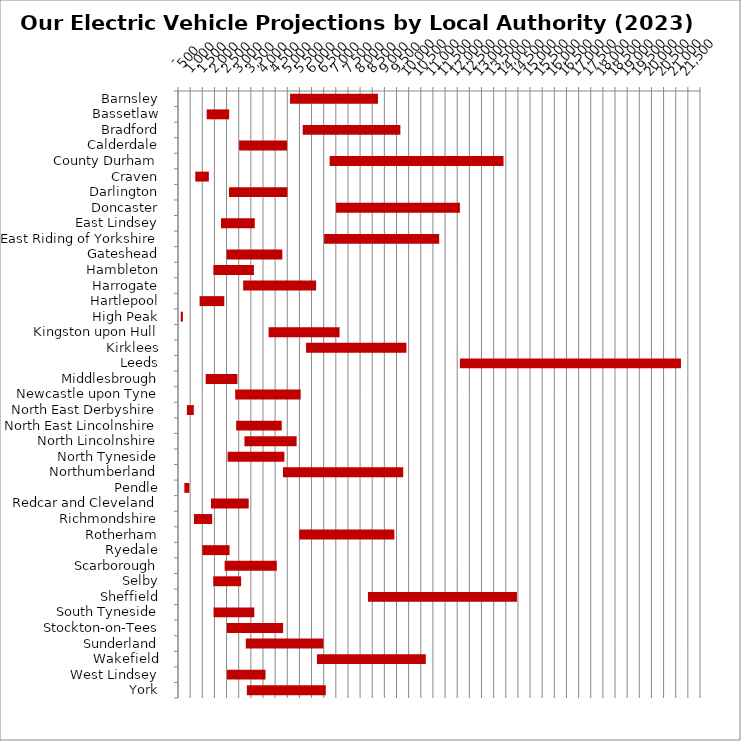
| Category | MIN | MAX |
|---|---|---|
| Barnsley | 4614 | 3622 |
| Bassetlaw | 1181 | 927 |
| Bradford | 5136 | 4023 |
| Calderdale | 2517 | 1977 |
| County Durham | 6245 | 7162 |
| Craven | 712 | 559 |
| Darlington | 2100 | 2407 |
| Doncaster | 6509 | 5104 |
| East Lindsey | 1771 | 1391 |
| East Riding of Yorkshire | 6017 | 4740 |
| Gateshead | 2002 | 2296 |
| Hambleton | 1457 | 1671 |
| Harrogate | 2683 | 3005 |
| Hartlepool | 888 | 1018 |
| High Peak | 113 | 88 |
| Kingston upon Hull | 3731 | 2924 |
| Kirklees | 5274 | 4135 |
| Leeds | 11610 | 9106 |
| Middlesbrough | 1141 | 1308 |
| Newcastle upon Tyne | 2356 | 2697 |
| North East Derbyshire | 365 | 286 |
| North East Lincolnshire | 2395 | 1878 |
| North Lincolnshire | 2737 | 2149 |
| North Tyneside | 2043 | 2339 |
| Northumberland | 4325 | 4951 |
| Pendle | 261 | 205 |
| Redcar and Cleveland | 1357 | 1555 |
| Richmondshire | 656 | 752 |
| Rotherham | 4994 | 3917 |
| Ryedale | 1000 | 1123 |
| Scarborough | 1921 | 2149 |
| Selby | 1452 | 1147 |
| Sheffield | 7824 | 6137 |
| South Tyneside | 1465 | 1678 |
| Stockton-on-Tees | 2015 | 2314 |
| Sunderland | 2793 | 3197 |
| Wakefield | 5722 | 4484 |
| West Lindsey | 2021 | 1584 |
| York | 2836 | 3251 |